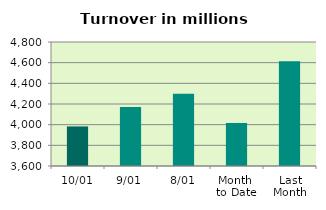
| Category | Series 0 |
|---|---|
| 10/01 | 3983.009 |
| 9/01 | 4172.136 |
| 8/01 | 4299.843 |
| Month 
to Date | 4016.86 |
| Last
Month | 4613.793 |